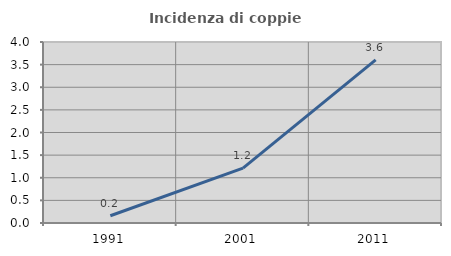
| Category | Incidenza di coppie miste |
|---|---|
| 1991.0 | 0.161 |
| 2001.0 | 1.213 |
| 2011.0 | 3.604 |